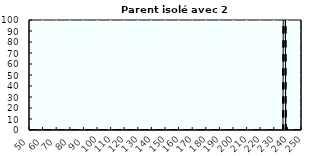
| Category | Coin fiscal marginal (somme des composantes) | Taux d’imposition marginal net |
|---|---|---|
| 50.0 | 0 | 0 |
| 51.0 | 0 | 0 |
| 52.0 | 0 | 0 |
| 53.0 | 0 | 0 |
| 54.0 | 0 | 0 |
| 55.0 | 0 | 0 |
| 56.0 | 0 | 0 |
| 57.0 | 0 | 0 |
| 58.0 | 0 | 0 |
| 59.0 | 0 | 0 |
| 60.0 | 0 | 0 |
| 61.0 | 0 | 0 |
| 62.0 | 0 | 0 |
| 63.0 | 0 | 0 |
| 64.0 | 0 | 0 |
| 65.0 | 0 | 0 |
| 66.0 | 0 | 0 |
| 67.0 | 0 | 0 |
| 68.0 | 0 | 0 |
| 69.0 | 0 | 0 |
| 70.0 | 0 | 0 |
| 71.0 | 0 | 0 |
| 72.0 | 0 | 0 |
| 73.0 | 0 | 0 |
| 74.0 | 0 | 0 |
| 75.0 | 0 | 0 |
| 76.0 | 0 | 0 |
| 77.0 | 0 | 0 |
| 78.0 | 0 | 0 |
| 79.0 | 0 | 0 |
| 80.0 | 0 | 0 |
| 81.0 | 0 | 0 |
| 82.0 | 0 | 0 |
| 83.0 | 0 | 0 |
| 84.0 | 0 | 0 |
| 85.0 | 0 | 0 |
| 86.0 | 0 | 0 |
| 87.0 | 0 | 0 |
| 88.0 | 0 | 0 |
| 89.0 | 0 | 0 |
| 90.0 | 0 | 0 |
| 91.0 | 0 | 0 |
| 92.0 | 0 | 0 |
| 93.0 | 0 | 0 |
| 94.0 | 0 | 0 |
| 95.0 | 0 | 0 |
| 96.0 | 0 | 0 |
| 97.0 | 0 | 0 |
| 98.0 | 0 | 0 |
| 99.0 | 0 | 0 |
| 100.0 | 0 | 0 |
| 101.0 | 0 | 0 |
| 102.0 | 0 | 0 |
| 103.0 | 0 | 0 |
| 104.0 | 0 | 0 |
| 105.0 | 0 | 0 |
| 106.0 | 0 | 0 |
| 107.0 | 0 | 0 |
| 108.0 | 0 | 0 |
| 109.0 | 0 | 0 |
| 110.0 | 0 | 0 |
| 111.0 | 0 | 0 |
| 112.0 | 0 | 0 |
| 113.0 | 0 | 0 |
| 114.0 | 0 | 0 |
| 115.0 | 0 | 0 |
| 116.0 | 0 | 0 |
| 117.0 | 0 | 0 |
| 118.0 | 0 | 0 |
| 119.0 | 0 | 0 |
| 120.0 | 0 | 0 |
| 121.0 | 0 | 0 |
| 122.0 | 0 | 0 |
| 123.0 | 0 | 0 |
| 124.0 | 0 | 0 |
| 125.0 | 0 | 0 |
| 126.0 | 0 | 0 |
| 127.0 | 0 | 0 |
| 128.0 | 0 | 0 |
| 129.0 | 0 | 0 |
| 130.0 | 0 | 0 |
| 131.0 | 0 | 0 |
| 132.0 | 0 | 0 |
| 133.0 | 0 | 0 |
| 134.0 | 0 | 0 |
| 135.0 | 0 | 0 |
| 136.0 | 0 | 0 |
| 137.0 | 0 | 0 |
| 138.0 | 0 | 0 |
| 139.0 | 0 | 0 |
| 140.0 | 0 | 0 |
| 141.0 | 0 | 0 |
| 142.0 | 0 | 0 |
| 143.0 | 0 | 0 |
| 144.0 | 0 | 0 |
| 145.0 | 0 | 0 |
| 146.0 | 0 | 0 |
| 147.0 | 0 | 0 |
| 148.0 | 0 | 0 |
| 149.0 | 0 | 0 |
| 150.0 | 0 | 0 |
| 151.0 | 0 | 0 |
| 152.0 | 0 | 0 |
| 153.0 | 0 | 0 |
| 154.0 | 0 | 0 |
| 155.0 | 0 | 0 |
| 156.0 | 0 | 0 |
| 157.0 | 0 | 0 |
| 158.0 | 0 | 0 |
| 159.0 | 0 | 0 |
| 160.0 | 0 | 0 |
| 161.0 | 0 | 0 |
| 162.0 | 0 | 0 |
| 163.0 | 0 | 0 |
| 164.0 | 0 | 0 |
| 165.0 | 0 | 0 |
| 166.0 | 0 | 0 |
| 167.0 | 0 | 0 |
| 168.0 | 0 | 0 |
| 169.0 | 0 | 0 |
| 170.0 | 0 | 0 |
| 171.0 | 0 | 0 |
| 172.0 | 0 | 0 |
| 173.0 | 0 | 0 |
| 174.0 | 0 | 0 |
| 175.0 | 0 | 0 |
| 176.0 | 0 | 0 |
| 177.0 | 0 | 0 |
| 178.0 | 0 | 0 |
| 179.0 | 0 | 0 |
| 180.0 | 0 | 0 |
| 181.0 | 0 | 0 |
| 182.0 | 0 | 0 |
| 183.0 | 0 | 0 |
| 184.0 | 0 | 0 |
| 185.0 | 0 | 0 |
| 186.0 | 0 | 0 |
| 187.0 | 0 | 0 |
| 188.0 | 0 | 0 |
| 189.0 | 0 | 0 |
| 190.0 | 0 | 0 |
| 191.0 | 0 | 0 |
| 192.0 | 0 | 0 |
| 193.0 | 0 | 0 |
| 194.0 | 0 | 0 |
| 195.0 | 0 | 0 |
| 196.0 | 0 | 0 |
| 197.0 | 0 | 0 |
| 198.0 | 0 | 0 |
| 199.0 | 0 | 0 |
| 200.0 | 0 | 0 |
| 201.0 | 0 | 0 |
| 202.0 | 0 | 0 |
| 203.0 | 0 | 0 |
| 204.0 | 0 | 0 |
| 205.0 | 0 | 0 |
| 206.0 | 0 | 0 |
| 207.0 | 0 | 0 |
| 208.0 | 0 | 0 |
| 209.0 | 0 | 0 |
| 210.0 | 0 | 0 |
| 211.0 | 0 | 0 |
| 212.0 | 0 | 0 |
| 213.0 | 0 | 0 |
| 214.0 | 0 | 0 |
| 215.0 | 0 | 0 |
| 216.0 | 0 | 0 |
| 217.0 | 0 | 0 |
| 218.0 | 0 | 0 |
| 219.0 | 0 | 0 |
| 220.0 | 0 | 0 |
| 221.0 | 0 | 0 |
| 222.0 | 0 | 0 |
| 223.0 | 0 | 0 |
| 224.0 | 0 | 0 |
| 225.0 | 0 | 0 |
| 226.0 | 0 | 0 |
| 227.0 | 0 | 0 |
| 228.0 | 0 | 0 |
| 229.0 | 0 | 0 |
| 230.0 | 0 | 0 |
| 231.0 | 0 | 0 |
| 232.0 | 0 | 0 |
| 233.0 | 0 | 0 |
| 234.0 | 0 | 0 |
| 235.0 | 0 | 0 |
| 236.0 | 0 | 0 |
| 237.0 | 488.391 | 488.391 |
| 238.0 | 0 | 0 |
| 239.0 | 0 | 0 |
| 240.0 | 0 | 0 |
| 241.0 | 0 | 0 |
| 242.0 | 0 | 0 |
| 243.0 | 0 | 0 |
| 244.0 | 0 | 0 |
| 245.0 | 0 | 0 |
| 246.0 | 0 | 0 |
| 247.0 | 0 | 0 |
| 248.0 | 0 | 0 |
| 249.0 | 0 | 0 |
| 250.0 | 0 | 0 |